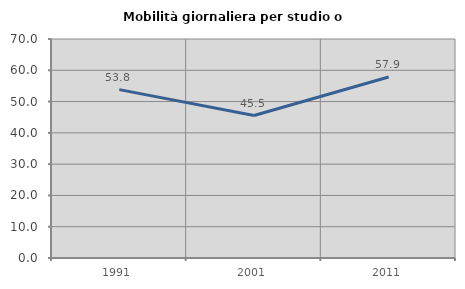
| Category | Mobilità giornaliera per studio o lavoro |
|---|---|
| 1991.0 | 53.823 |
| 2001.0 | 45.547 |
| 2011.0 | 57.866 |